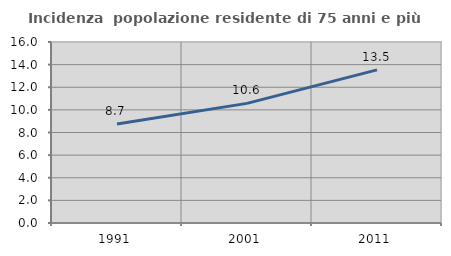
| Category | Incidenza  popolazione residente di 75 anni e più |
|---|---|
| 1991.0 | 8.744 |
| 2001.0 | 10.576 |
| 2011.0 | 13.538 |